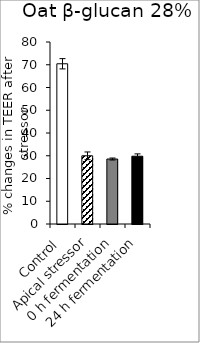
| Category | average |
|---|---|
| Control | 70.429 |
| Apical stressor | 29.977 |
| 0 h fermentation | 28.562 |
| 24 h fermentation | 29.798 |